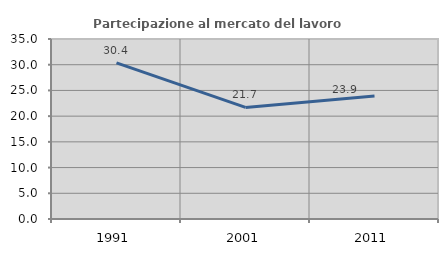
| Category | Partecipazione al mercato del lavoro  femminile |
|---|---|
| 1991.0 | 30.362 |
| 2001.0 | 21.695 |
| 2011.0 | 23.902 |